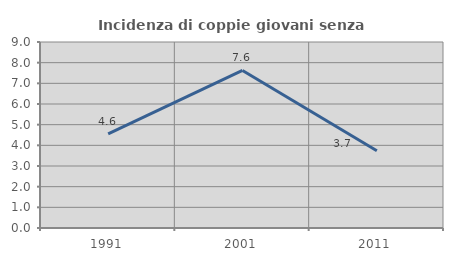
| Category | Incidenza di coppie giovani senza figli |
|---|---|
| 1991.0 | 4.554 |
| 2001.0 | 7.624 |
| 2011.0 | 3.735 |